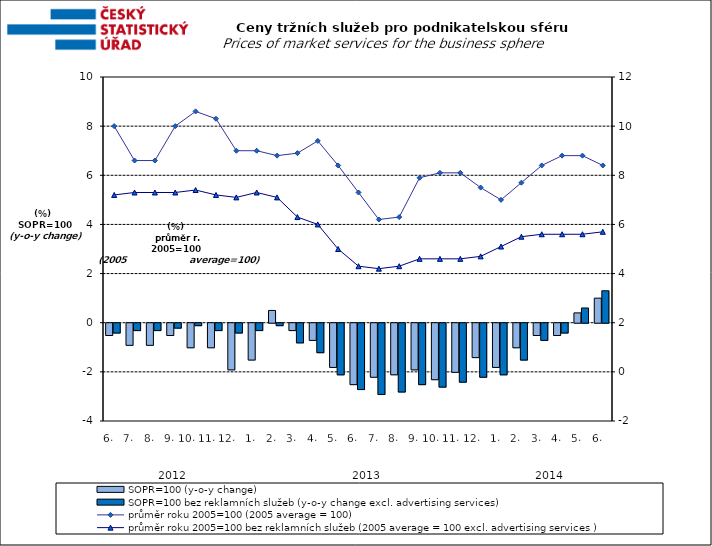
| Category | SOPR=100 (y-o-y change)   | SOPR=100 bez reklamních služeb (y-o-y change excl. advertising services)   |
|---|---|---|
| 0 | -0.5 | -0.4 |
| 1 | -0.9 | -0.3 |
| 2 | -0.9 | -0.3 |
| 3 | -0.5 | -0.2 |
| 4 | -1 | -0.1 |
| 5 | -1 | -0.3 |
| 6 | -1.9 | -0.4 |
| 7 | -1.5 | -0.3 |
| 8 | 0.5 | -0.1 |
| 9 | -0.3 | -0.8 |
| 10 | -0.7 | -1.2 |
| 11 | -1.8 | -2.1 |
| 12 | -2.5 | -2.7 |
| 13 | -2.2 | -2.9 |
| 14 | -2.1 | -2.8 |
| 15 | -1.9 | -2.5 |
| 16 | -2.3 | -2.6 |
| 17 | -2 | -2.4 |
| 18 | -1.4 | -2.2 |
| 19 | -1.8 | -2.1 |
| 20 | -1 | -1.5 |
| 21 | -0.5 | -0.7 |
| 22 | -0.5 | -0.4 |
| 23 | 0.4 | 0.6 |
| 24 | 1 | 1.3 |